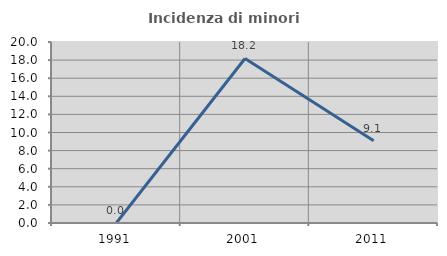
| Category | Incidenza di minori stranieri |
|---|---|
| 1991.0 | 0 |
| 2001.0 | 18.182 |
| 2011.0 | 9.091 |